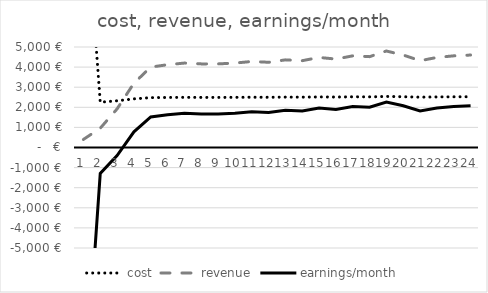
| Category | cost | revenue | earnings/month |
|---|---|---|---|
| 0 | 13710 | 400 | -13310 |
| 1 | 2252 | 960 | -1292 |
| 2 | 2324 | 1920 | -404 |
| 3 | 2420 | 3200 | 780 |
| 4 | 2480 | 4000 | 1520 |
| 5 | 2489 | 4120 | 1631 |
| 6 | 2495 | 4200 | 1705 |
| 7 | 2492 | 4160 | 1668 |
| 8 | 2492 | 4160 | 1668 |
| 9 | 2495 | 4200 | 1705 |
| 10 | 2501 | 4280 | 1779 |
| 11 | 2498 | 4240 | 1742 |
| 12 | 2507 | 4360 | 1853 |
| 13 | 2504 | 4320 | 1816 |
| 14 | 2516 | 4480 | 1964 |
| 15 | 2510 | 4400 | 1890 |
| 16 | 2522 | 4560 | 2038 |
| 17 | 2519 | 4520 | 2001 |
| 18 | 2540 | 4800 | 2260 |
| 19 | 2525 | 4600 | 2075 |
| 20 | 2504 | 4320 | 1816 |
| 21 | 2516 | 4480 | 1964 |
| 22 | 2522 | 4560 | 2038 |
| 23 | 2525 | 4600 | 2075 |